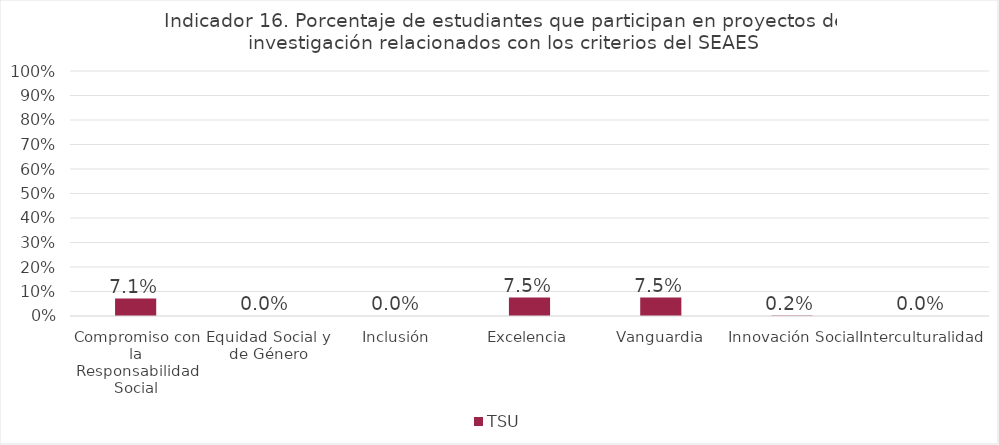
| Category | TSU |
|---|---|
| Compromiso con la Responsabilidad Social | 0.071 |
| Equidad Social y de Género | 0 |
| Inclusión | 0 |
| Excelencia | 0.075 |
| Vanguardia | 0.075 |
| Innovación Social | 0.002 |
| Interculturalidad | 0 |